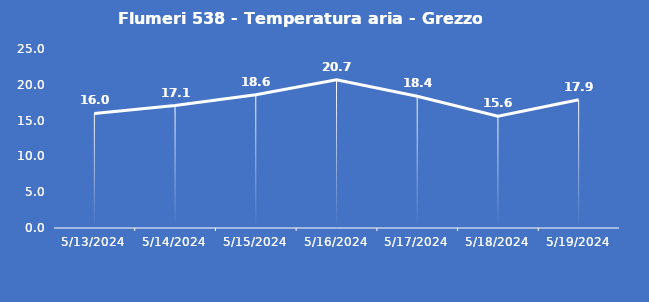
| Category | Flumeri 538 - Temperatura aria - Grezzo (°C) |
|---|---|
| 5/13/24 | 16 |
| 5/14/24 | 17.1 |
| 5/15/24 | 18.6 |
| 5/16/24 | 20.7 |
| 5/17/24 | 18.4 |
| 5/18/24 | 15.6 |
| 5/19/24 | 17.9 |